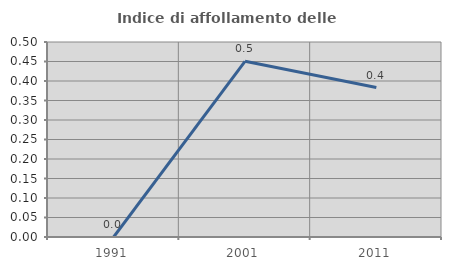
| Category | Indice di affollamento delle abitazioni  |
|---|---|
| 1991.0 | 0 |
| 2001.0 | 0.45 |
| 2011.0 | 0.383 |